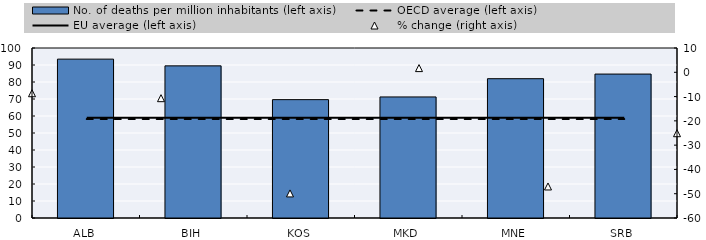
| Category | No. of deaths per million inhabitants (left axis) |
|---|---|
| ALB | 93.453 |
| BIH | 89.492 |
| KOS | 69.623 |
| MKD | 71.207 |
| MNE | 81.942 |
| SRB | 84.669 |